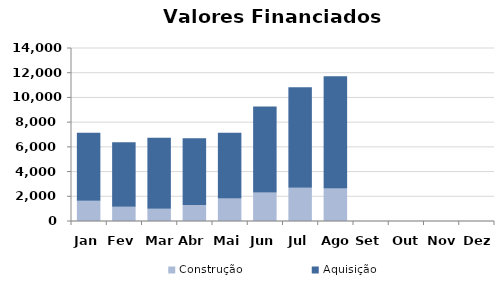
| Category | Construção | Aquisição  |
|---|---|---|
| Jan | 1647.218 | 5494.876 |
| Fev | 1152.824 | 5222.822 |
| Mar | 988.527 | 5741.891 |
| Abr | 1298.638 | 5402.188 |
| Mai | 1814.008 | 5319.9 |
| Jun | 2314.503 | 6953.565 |
| Jul | 2686.171 | 8133.926 |
| Ago | 2622.976 | 9096.504 |
| Set | 0 | 0 |
| Out | 0 | 0 |
| Nov | 0 | 0 |
| Dez | 0 | 0 |